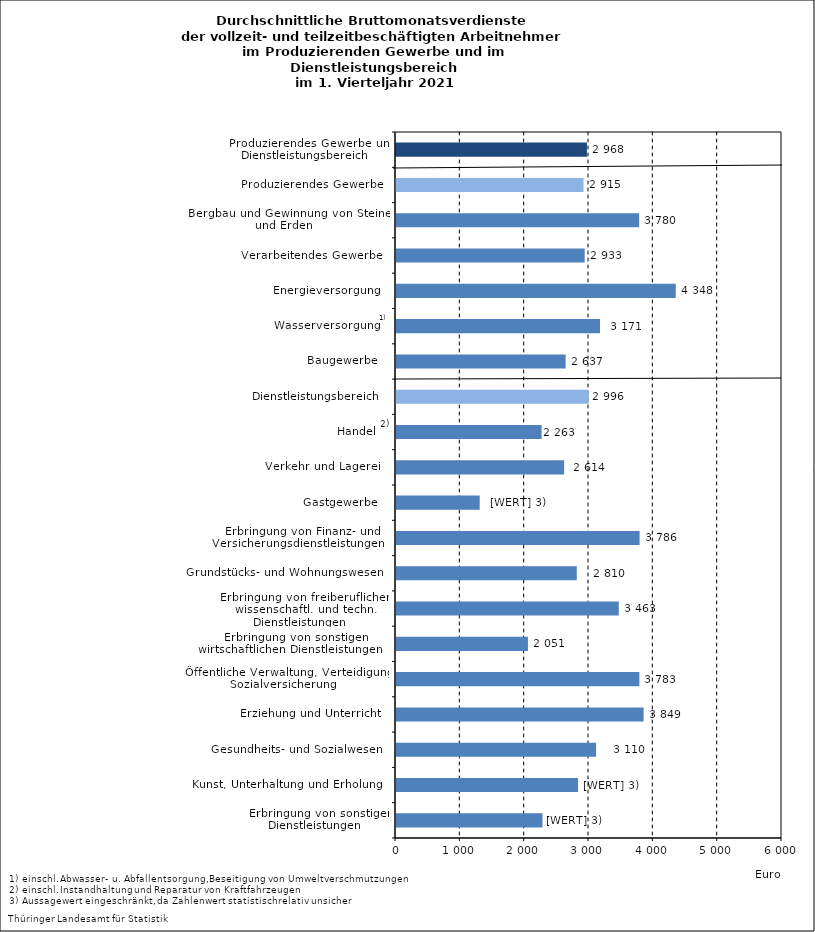
| Category | Series 0 |
|---|---|
| Erbringung von sonstigen Dienstleistungen    | 2277 |
| Kunst, Unterhaltung und Erholung    | 2829 |
| Gesundheits- und Sozialwesen    | 3110 |
| Erziehung und Unterricht    | 3849 |
| Öffentliche Verwaltung, Verteidigung, Sozialversicherung    | 3783 |
| Erbringung von sonstigen wirtschaftlichen Dienstleistungen    | 2051 |
| Erbringung von freiberuflichen, wissenschaftl. und techn. Dienstleistungen    | 3463 |
| Grundstücks- und Wohnungswesen    | 2810 |
| Erbringung von Finanz- und Versicherungsdienstleistungen    | 3786 |
| Gastgewerbe    | 1301 |
| Verkehr und Lagerei    | 2614 |
| Handel    | 2263 |
| Dienstleistungsbereich    | 2996 |
| Baugewerbe    | 2637 |
| Wasserversorgung    | 3171 |
| Energieversorgung    | 4348 |
| Verarbeitendes Gewerbe    | 2933 |
| Bergbau und Gewinnung von Steinen und Erden    | 3780 |
| Produzierendes Gewerbe    | 2915 |
| Produzierendes Gewerbe und Dienstleistungsbereich    | 2968 |